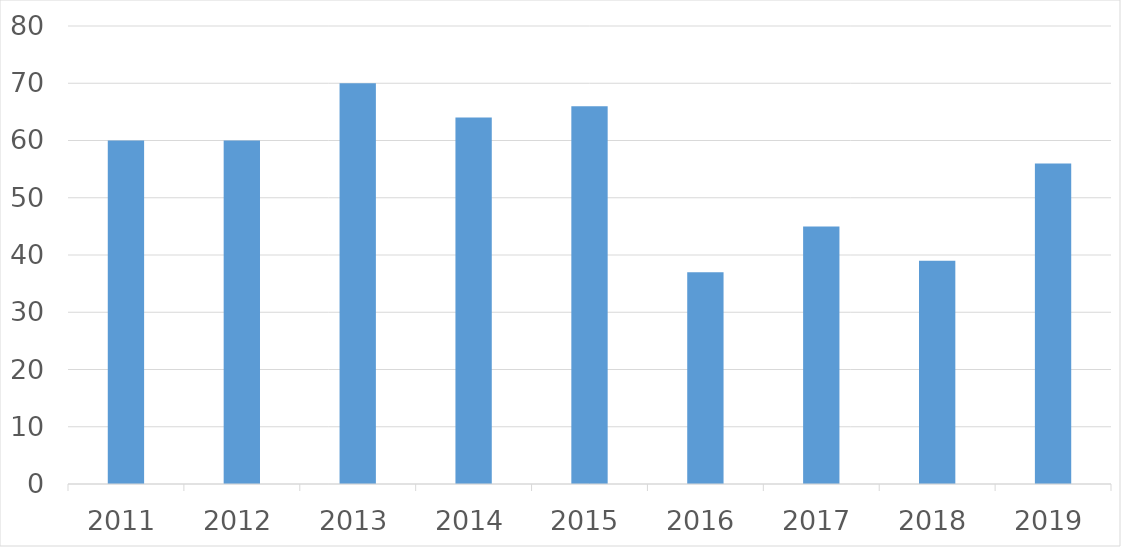
| Category | Series 0 |
|---|---|
| 2011 | 60 |
| 2012 | 60 |
| 2013 | 70 |
| 2014 | 64 |
| 2015 | 66 |
| 2016 | 37 |
| 2017 | 45 |
| 2018 | 39 |
| 2019 | 56 |